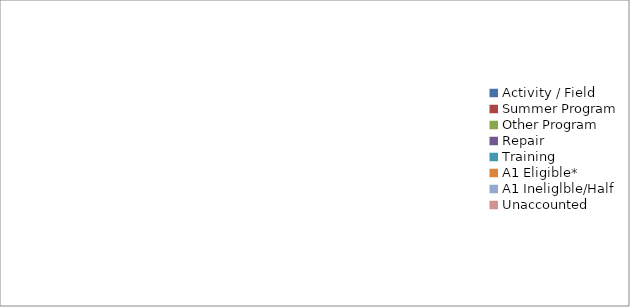
| Category | Series 0 |
|---|---|
| Activity / Field | 0 |
| Summer Program | 0 |
| Other Program | 0 |
| Repair | 0 |
| Training | 0 |
| A1 Eligible* | 0 |
| A1 Ineliglble/Half | 0 |
| Unaccounted | 0 |